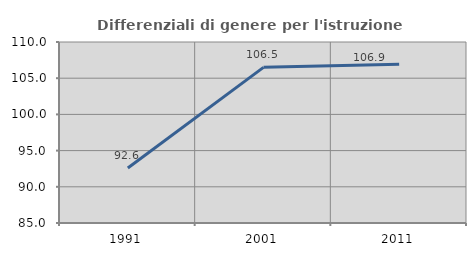
| Category | Differenziali di genere per l'istruzione superiore |
|---|---|
| 1991.0 | 92.608 |
| 2001.0 | 106.499 |
| 2011.0 | 106.928 |